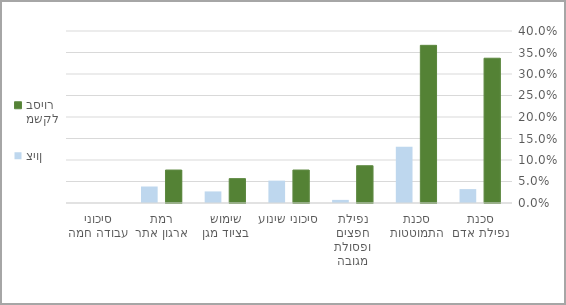
| Category | משקל בסיור | ציון |
|---|---|---|
| סכנת נפילת אדם | 0.337 | 0.032 |
| סכנת התמוטטות | 0.367 | 0.131 |
| נפילת חפצים ופסולת מגובה | 0.087 | 0.007 |
| סיכוני שינוע | 0.077 | 0.052 |
| שימוש בציוד מגן | 0.057 | 0.027 |
| רמת ארגון אתר | 0.077 | 0.038 |
| סיכוני עבודה חמה | 0 | 0 |